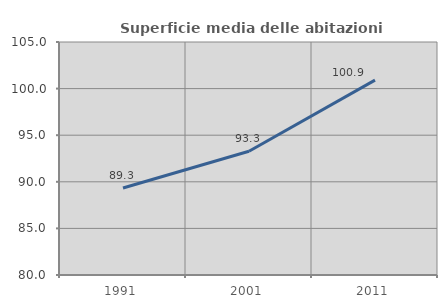
| Category | Superficie media delle abitazioni occupate |
|---|---|
| 1991.0 | 89.33 |
| 2001.0 | 93.273 |
| 2011.0 | 100.907 |